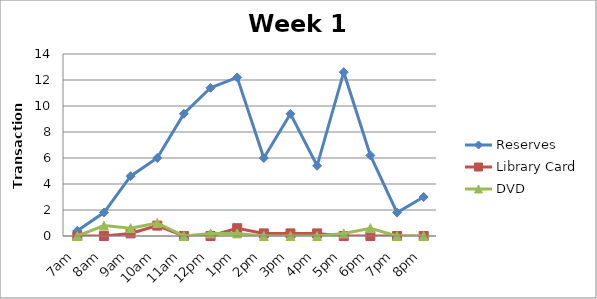
| Category | Reserves | Library Card | DVD |
|---|---|---|---|
| 7am | 0.4 | 0 | 0 |
| 8am | 1.8 | 0 | 0.8 |
| 9am | 4.6 | 0.2 | 0.6 |
| 10am | 6 | 0.8 | 1 |
| 11am | 9.4 | 0 | 0 |
| 12pm | 11.4 | 0 | 0.2 |
| 1pm | 12.2 | 0.6 | 0.2 |
| 2pm | 6 | 0.2 | 0 |
| 3pm | 9.4 | 0.2 | 0 |
| 4pm | 5.4 | 0.2 | 0 |
| 5pm | 12.6 | 0 | 0.2 |
| 6pm | 6.2 | 0 | 0.6 |
| 7pm | 1.8 | 0 | 0 |
| 8pm | 3 | 0 | 0 |